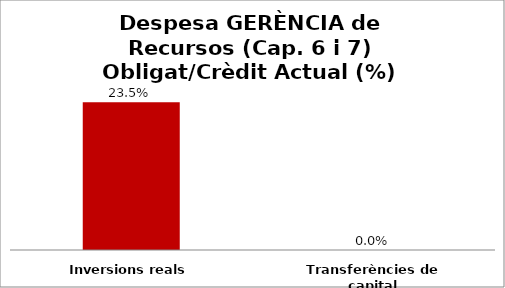
| Category | Series 0 |
|---|---|
| Inversions reals | 0.235 |
| Transferències de capital | 0 |